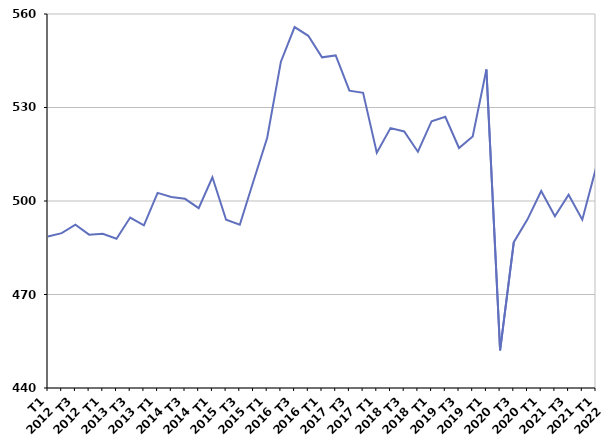
| Category | Ensemble des entrées en catégories A, B, C |
|---|---|
| T1
2012 | 488.6 |
| T2
2012 | 489.7 |
| T3
2012 | 492.4 |
| T4
2012 | 489.2 |
| T1
2013 | 489.5 |
| T2
2013 | 487.9 |
| T3
2013 | 494.7 |
| T4
2013 | 492.2 |
| T1
2014 | 502.6 |
| T2
2014 | 501.3 |
| T3
2014 | 500.7 |
| T4
2014 | 497.7 |
| T1
2015 | 507.6 |
| T2
2015 | 494 |
| T3
2015 | 492.4 |
| T4
2015 | 506.4 |
| T1
2016 | 520.3 |
| T2
2016 | 544.7 |
| T3
2016 | 555.8 |
| T4
2016 | 553 |
| T1
2017 | 546.1 |
| T2
2017 | 546.7 |
| T3
2017 | 535.4 |
| T4
2017 | 534.7 |
| T1
2018 | 515.5 |
| T2
2018 | 523.4 |
| T3
2018 | 522.3 |
| T4
2018 | 515.8 |
| T1
2019 | 525.6 |
| T2
2019 | 527 |
| T3
2019 | 517 |
| T4
2019 | 520.7 |
| T1
2020 | 542.2 |
| T2
2020 | 452.1 |
| T3
2020 | 486.8 |
| T4
2020 | 494.1 |
| T1
2021 | 503.2 |
| T2
2021 | 495.1 |
| T3
2021 | 502 |
| T4
2021 | 494 |
| T1
2022 | 510.6 |